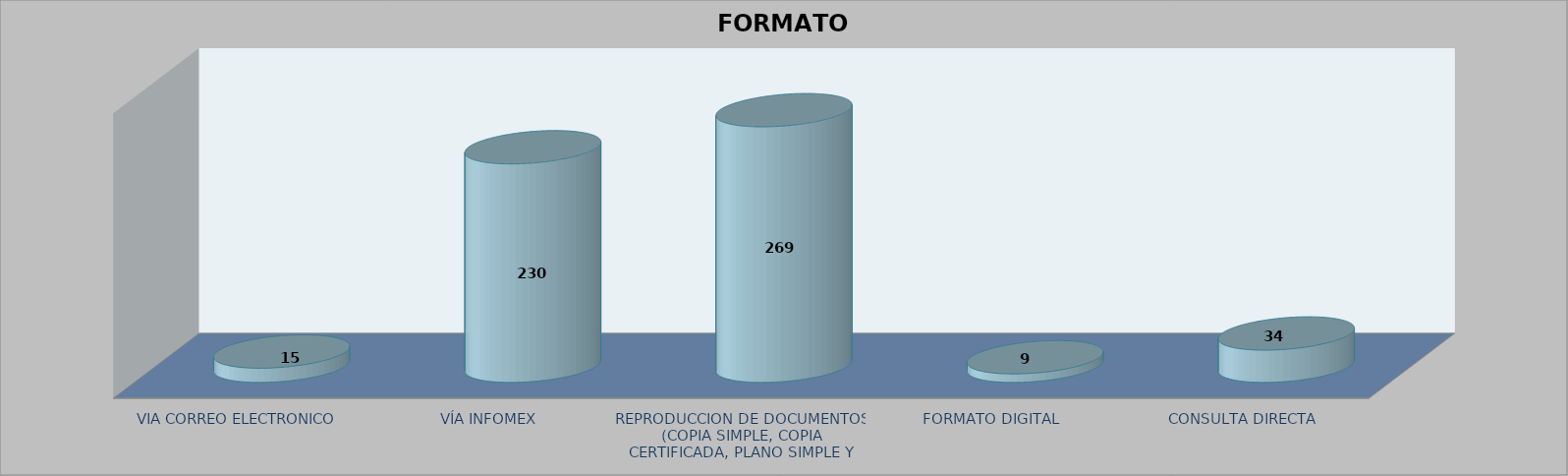
| Category |        FORMATO SOLICITADO | Series 1 | Series 2 |
|---|---|---|---|
| VIA CORREO ELECTRONICO |  |  | 15 |
| VÍA INFOMEX |  |  | 230 |
| REPRODUCCION DE DOCUMENTOS (COPIA SIMPLE, COPIA CERTIFICADA, PLANO SIMPLE Y PLANO CERTIFICADO) |  |  | 269 |
| FORMATO DIGITAL |  |  | 9 |
| CONSULTA DIRECTA |  |  | 34 |